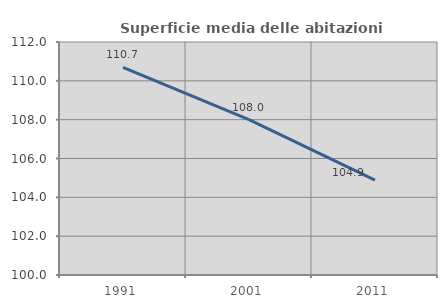
| Category | Superficie media delle abitazioni occupate |
|---|---|
| 1991.0 | 110.696 |
| 2001.0 | 107.998 |
| 2011.0 | 104.882 |